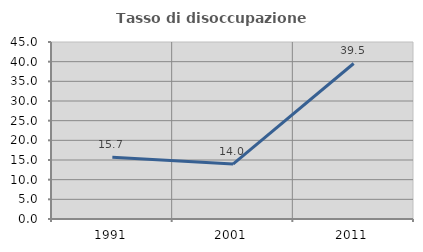
| Category | Tasso di disoccupazione giovanile  |
|---|---|
| 1991.0 | 15.698 |
| 2001.0 | 13.953 |
| 2011.0 | 39.535 |